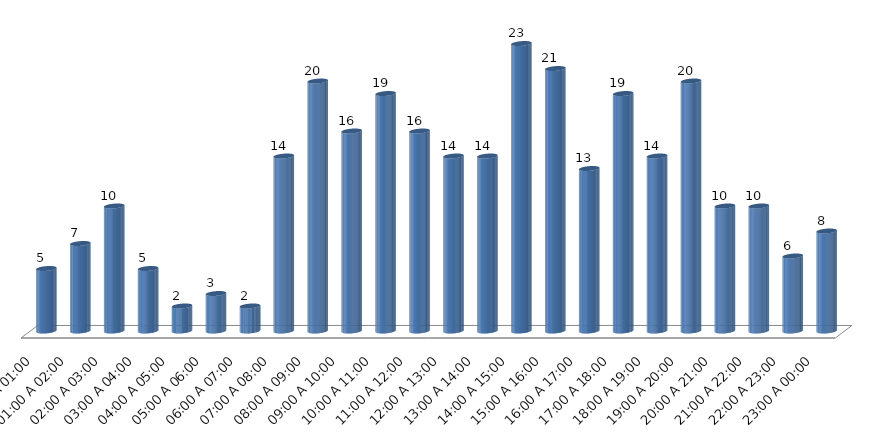
| Category | COMPUTO |
|---|---|
| 00:00 A 01:00 | 5 |
| 01:00 A 02:00 | 7 |
| 02:00 A 03:00 | 10 |
| 03:00 A 04:00 | 5 |
| 04:00 A 05:00 | 2 |
| 05:00 A 06:00 | 3 |
| 06:00 A 07:00 | 2 |
| 07:00 A 08:00 | 14 |
| 08:00 A 09:00 | 20 |
| 09:00 A 10:00 | 16 |
| 10:00 A 11:00 | 19 |
| 11:00 A 12:00 | 16 |
| 12:00 A 13:00 | 14 |
| 13:00 A 14:00 | 14 |
| 14:00 A 15:00 | 23 |
| 15:00 A 16:00 | 21 |
| 16:00 A 17:00 | 13 |
| 17:00 A 18:00 | 19 |
| 18:00 A 19:00 | 14 |
| 19:00 A 20:00 | 20 |
| 20:00 A 21:00 | 10 |
| 21:00 A 22:00 | 10 |
| 22:00 A 23:00 | 6 |
| 23:00 A 00:00 | 8 |